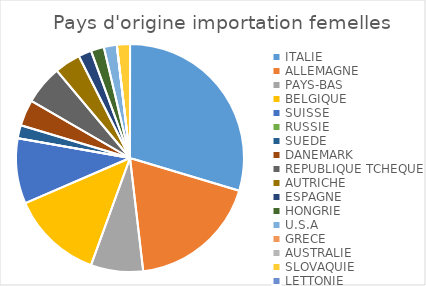
| Category | Series 0 |
|---|---|
| ITALIE | 16 |
| ALLEMAGNE | 10 |
| PAYS-BAS | 4 |
| BELGIQUE | 7 |
| SUISSE | 5 |
| RUSSIE | 0 |
| SUEDE | 1 |
| DANEMARK | 2 |
| REPUBLIQUE TCHEQUE | 3 |
| AUTRICHE | 2 |
| ESPAGNE | 1 |
| HONGRIE | 1 |
| U.S.A | 1 |
| GRECE | 0 |
| AUSTRALIE | 0 |
| SLOVAQUIE | 1 |
| LETTONIE | 0 |